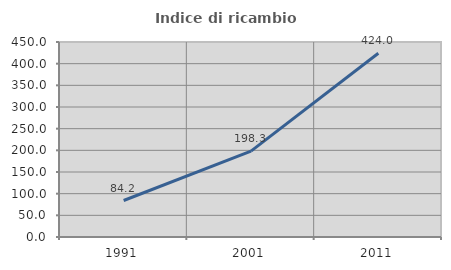
| Category | Indice di ricambio occupazionale  |
|---|---|
| 1991.0 | 84.229 |
| 2001.0 | 198.256 |
| 2011.0 | 423.958 |